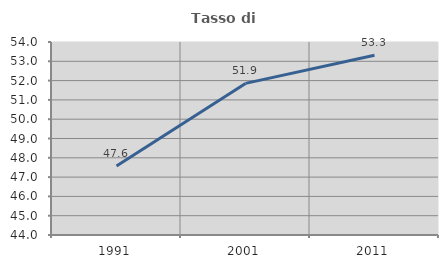
| Category | Tasso di occupazione   |
|---|---|
| 1991.0 | 47.57 |
| 2001.0 | 51.855 |
| 2011.0 | 53.312 |